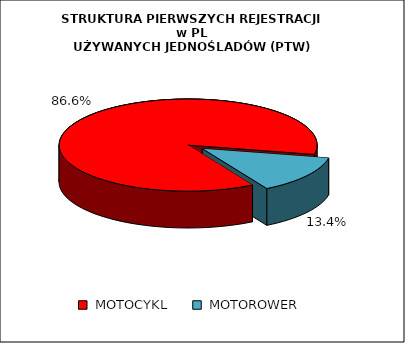
| Category | RAZEM |
|---|---|
|  MOTOCYKL  | 0.866 |
|  MOTOROWER  | 0.134 |